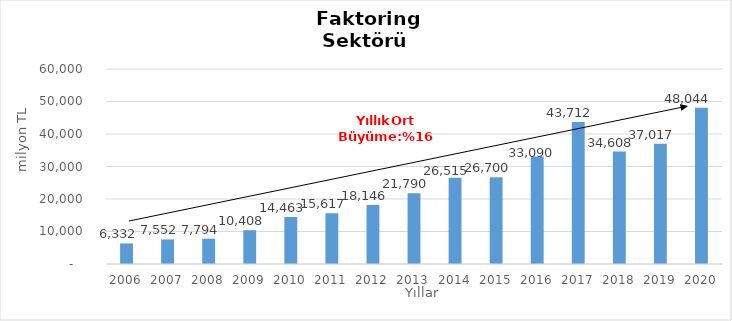
| Category | Faktoring  |
|---|---|
| 2006.0 | 6331.998 |
| 2007.0 | 7552.18 |
| 2008.0 | 7794.497 |
| 2009.0 | 10407.622 |
| 2010.0 | 14462.609 |
| 2011.0 | 15617.092 |
| 2012.0 | 18146.479 |
| 2013.0 | 21790.367 |
| 2014.0 | 26515 |
| 2015.0 | 26700 |
| 2016.0 | 33090 |
| 2017.0 | 43712 |
| 2018.0 | 34608 |
| 2019.0 | 37017 |
| 2020.0 | 48044 |